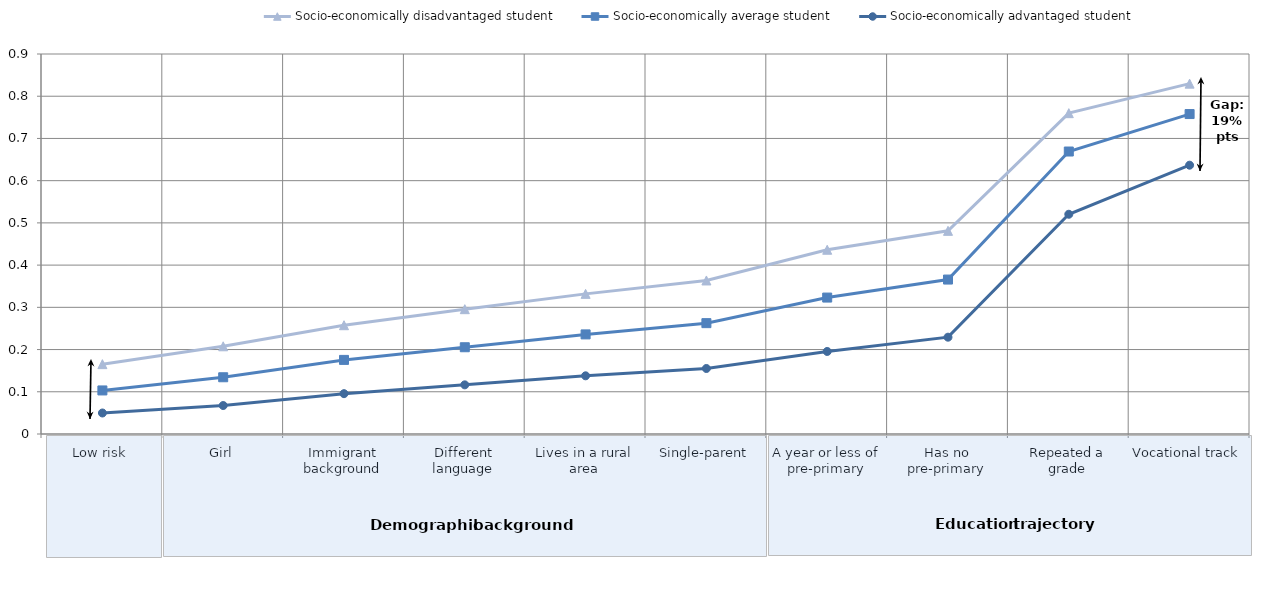
| Category | Socio-economically disadvantaged student | Socio-economically average student | Socio-economically advantaged student |
|---|---|---|---|
| Low risk | 0.165 | 0.103 | 0.05 |
| Girl | 0.208 | 0.134 | 0.067 |
| Immigrant background | 0.258 | 0.175 | 0.096 |
| Different language | 0.296 | 0.205 | 0.116 |
| Lives in a rural area | 0.332 | 0.236 | 0.138 |
| Single-parent | 0.364 | 0.263 | 0.155 |
| A year or less of pre-primary | 0.436 | 0.323 | 0.195 |
| Has no pre-primary | 0.481 | 0.366 | 0.229 |
| Repeated a grade | 0.76 | 0.669 | 0.52 |
| Vocational track | 0.83 | 0.758 | 0.637 |